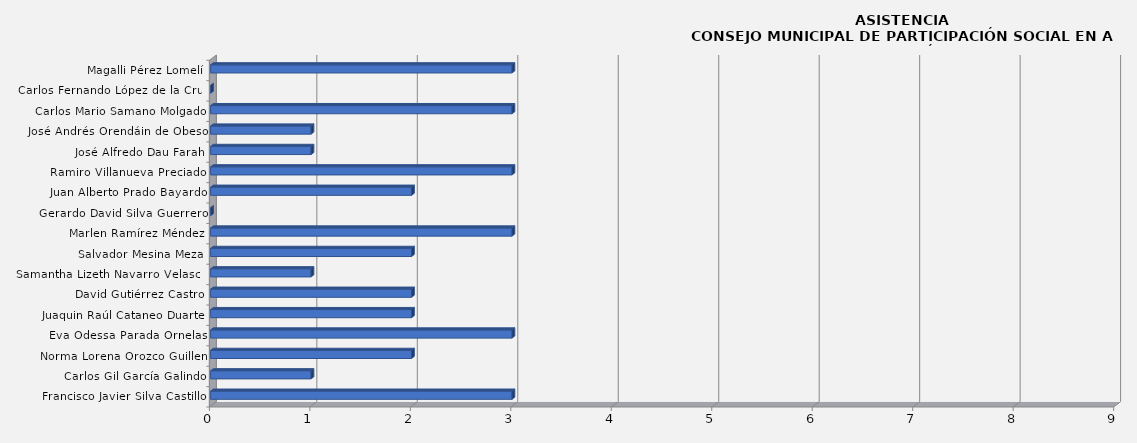
| Category | Series 0 |
|---|---|
| Francisco Javier Silva Castillo | 3 |
| Carlos Gil García Galindo | 1 |
| Norma Lorena Orozco Guillen | 2 |
| Eva Odessa Parada Ornelas | 3 |
| Juaquin Raúl Cataneo Duarte | 2 |
| David Gutiérrez Castro | 2 |
| Samantha Lizeth Navarro Velasco | 1 |
| Salvador Mesina Meza | 2 |
| Marlen Ramírez Méndez | 3 |
| Gerardo David Silva Guerrero | 0 |
| Juan Alberto Prado Bayardo | 2 |
| Ramiro Villanueva Preciado | 3 |
| José Alfredo Dau Farah | 1 |
| José Andrés Orendáin de Obeso | 1 |
| Carlos Mario Samano Molgado | 3 |
| Carlos Fernando López de la Cruz | 0 |
| Magalli Pérez Lomelí | 3 |